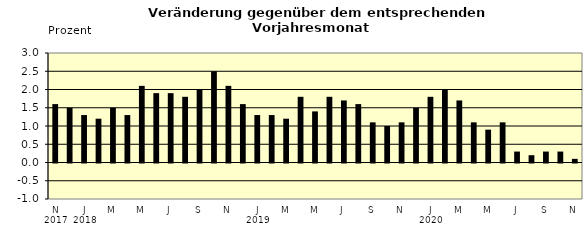
| Category | Series 0 |
|---|---|
| 0 | 1.6 |
| 1 | 1.5 |
| 2 | 1.3 |
| 3 | 1.2 |
| 4 | 1.5 |
| 5 | 1.3 |
| 6 | 2.1 |
| 7 | 1.9 |
| 8 | 1.9 |
| 9 | 1.8 |
| 10 | 2 |
| 11 | 2.5 |
| 12 | 2.1 |
| 13 | 1.6 |
| 14 | 1.3 |
| 15 | 1.3 |
| 16 | 1.2 |
| 17 | 1.8 |
| 18 | 1.4 |
| 19 | 1.8 |
| 20 | 1.7 |
| 21 | 1.6 |
| 22 | 1.1 |
| 23 | 1 |
| 24 | 1.1 |
| 25 | 1.5 |
| 26 | 1.8 |
| 27 | 2 |
| 28 | 1.7 |
| 29 | 1.1 |
| 30 | 0.9 |
| 31 | 1.1 |
| 32 | 0.3 |
| 33 | 0.2 |
| 34 | 0.3 |
| 35 | 0.3 |
| 36 | 0.1 |